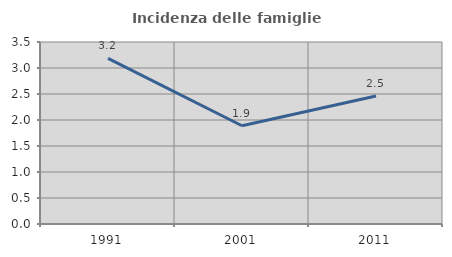
| Category | Incidenza delle famiglie numerose |
|---|---|
| 1991.0 | 3.186 |
| 2001.0 | 1.89 |
| 2011.0 | 2.463 |